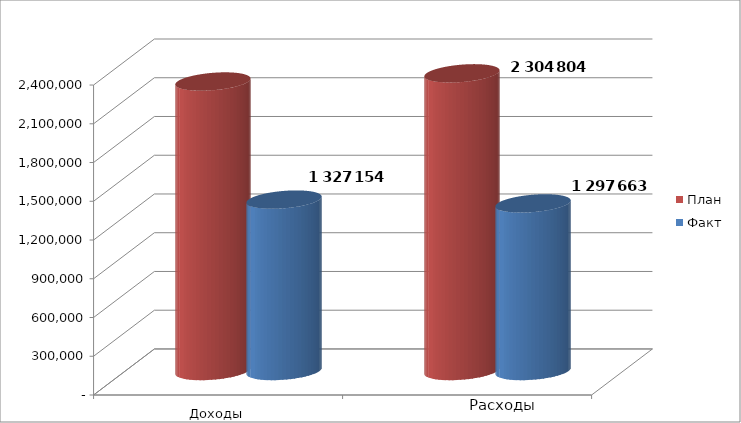
| Category | План | Факт |
|---|---|---|
| 0 | 2241429 | 1327154 |
| 1 | 2304804 | 1297662.9 |